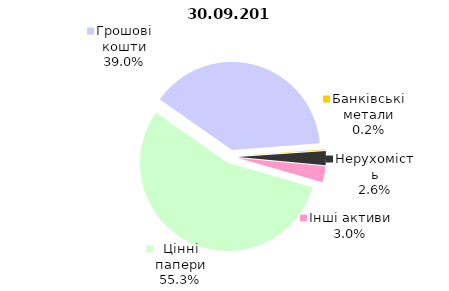
| Category | 30.09.2019 |
|---|---|
| Цінні папери | 1643.3 |
| Грошові кошти | 1160.3 |
| Банківські метали | 5 |
| Нерухомість | 76 |
| Інші активи | 88.1 |